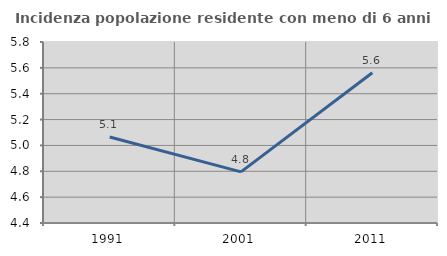
| Category | Incidenza popolazione residente con meno di 6 anni |
|---|---|
| 1991.0 | 5.066 |
| 2001.0 | 4.795 |
| 2011.0 | 5.562 |